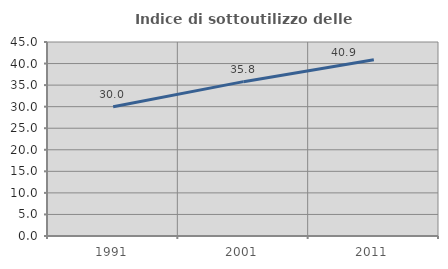
| Category | Indice di sottoutilizzo delle abitazioni  |
|---|---|
| 1991.0 | 30 |
| 2001.0 | 35.803 |
| 2011.0 | 40.863 |